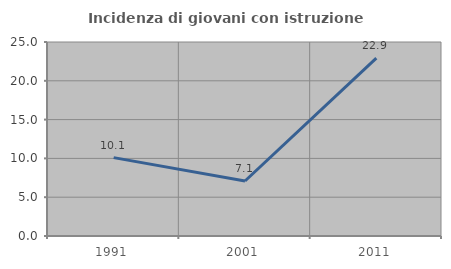
| Category | Incidenza di giovani con istruzione universitaria |
|---|---|
| 1991.0 | 10.101 |
| 2001.0 | 7.087 |
| 2011.0 | 22.917 |